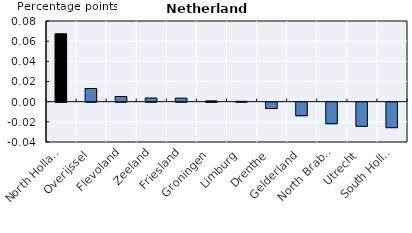
| Category | Series 0 | Series 1 | Series 2 | Series 3 |
|---|---|---|---|---|
| North Holland | 0.067 | 0 | 0 | 0 |
| Overijssel | 0 | 0 | 0.013 | 0 |
| Flevoland | 0 | 0 | 0.005 | 0 |
| Zeeland | 0 | 0 | 0.004 | 0 |
| Friesland | 0 | 0 | 0.004 | 0 |
| Groningen | 0.001 | 0 | 0 | 0 |
| Limburg | 0 | 0 | 0 | 0 |
| Drenthe | 0 | 0 | 0 | -0.006 |
| Gelderland | 0 | 0 | 0 | -0.013 |
| North Brabant | 0 | 0 | 0 | -0.021 |
| Utrecht | 0 | 0 | 0 | -0.024 |
| South Holland | 0 | 0 | -0.025 | 0 |